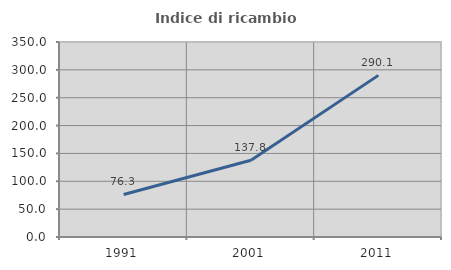
| Category | Indice di ricambio occupazionale  |
|---|---|
| 1991.0 | 76.331 |
| 2001.0 | 137.805 |
| 2011.0 | 290.095 |